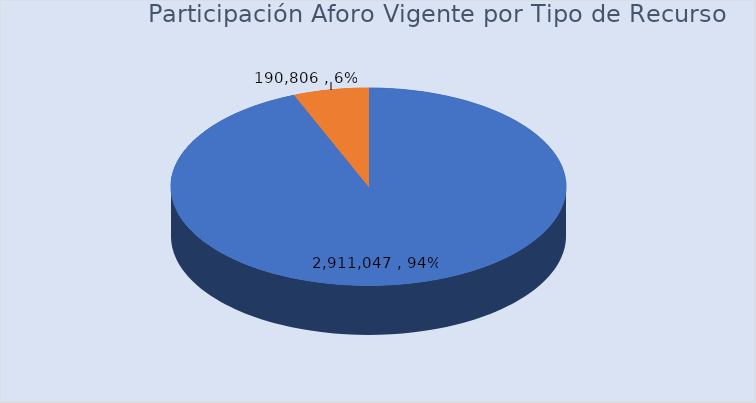
| Category | Total |
|---|---|
| Nación | 2911046.911 |
| Propios | 190805.665 |